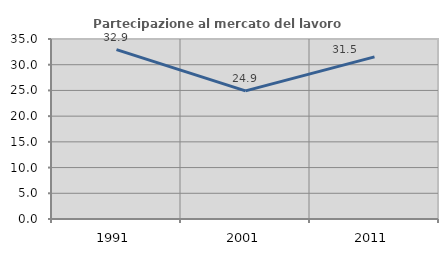
| Category | Partecipazione al mercato del lavoro  femminile |
|---|---|
| 1991.0 | 32.927 |
| 2001.0 | 24.919 |
| 2011.0 | 31.532 |